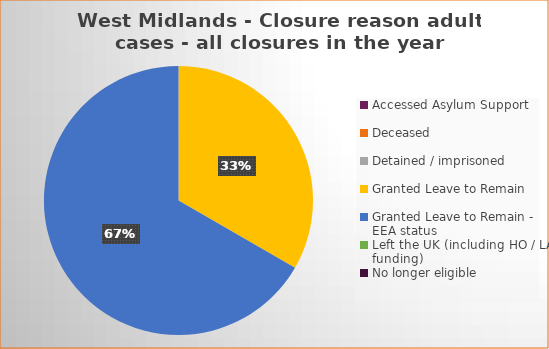
| Category | Total | Percentage |
|---|---|---|
| Accessed Asylum Support | 0 | 0 |
| Deceased | 0 | 0 |
| Detained / imprisoned | 0 | 0 |
| Granted Leave to Remain | 1 | 0.333 |
| Granted Leave to Remain - EEA status | 2 | 0.667 |
| Left the UK (including HO / LA funding)  | 0 | 0 |
| No longer eligible | 0 | 0 |